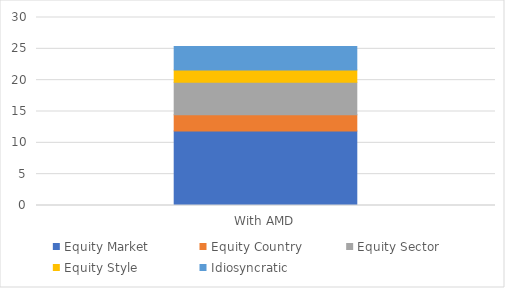
| Category | Equity Market | Equity Country | Equity Sector | Equity Style | Idiosyncratic |
|---|---|---|---|---|---|
| With AMD | 11.87 | 2.6 | 5.19 | 1.98 | 3.74 |